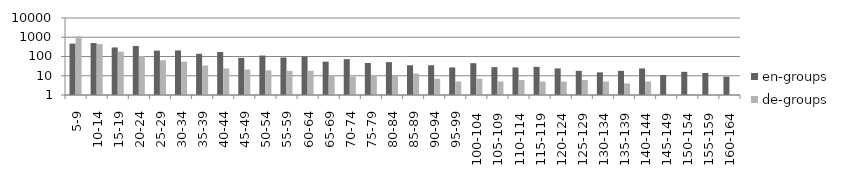
| Category | en-groups | de-groups |
|---|---|---|
| 5-9 | 466 | 1115 |
| 10-14 | 499 | 442 |
| 15-19 | 295 | 179 |
| 20-24 | 350 | 105 |
| 25-29 | 202 | 64 |
| 30-34 | 207 | 54 |
| 35-39 | 138 | 34 |
| 40-44 | 172 | 24 |
| 45-49 | 85 | 21 |
| 50-54 | 112 | 19 |
| 55-59 | 89 | 18 |
| 60-64 | 100 | 18 |
| 65-69 | 54 | 11 |
| 70-74 | 73 | 9 |
| 75-79 | 46 | 11 |
| 80-84 | 51 | 10 |
| 85-89 | 35 | 13 |
| 90-94 | 35 | 7 |
| 95-99 | 27 | 5 |
| 100-104 | 45 | 7 |
| 105-109 | 28 | 5 |
| 110-114 | 27 | 6 |
| 115-119 | 29 | 5 |
| 120-124 | 24 | 5 |
| 125-129 | 18 | 6 |
| 130-134 | 15 | 5 |
| 135-139 | 18 | 4 |
| 140-144 | 24 | 5 |
| 145-149 | 11 | 1 |
| 150-154 | 16 | 0 |
| 155-159 | 14 | 0 |
| 160-164 | 9 | 0 |